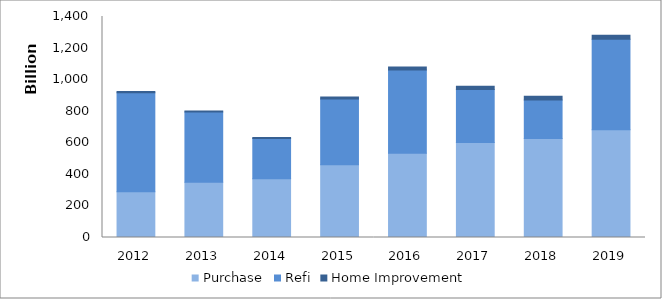
| Category | Purchase | Refi | Home Improvement |
|---|---|---|---|
| 2012.0 | 290055189677 | 626677758811 | 7393823646 |
| 2013.0 | 350218892695 | 444438330207 | 7112161775 |
| 2014.0 | 372353495048 | 254601193542 | 6773007232 |
| 2015.0 | 461162629670 | 416105861841 | 11996744688 |
| 2016.0 | 534386689978 | 526580019527 | 19895720920 |
| 2017.0 | 601770589007 | 335831966327 | 21077588707 |
| 2018.0 | 626729004090 | 244682659468 | 23211554117 |
| 2019.0 | 683200826206 | 572119624786 | 26222209046 |